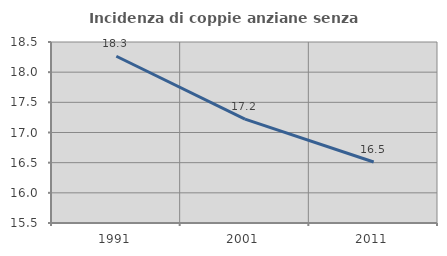
| Category | Incidenza di coppie anziane senza figli  |
|---|---|
| 1991.0 | 18.263 |
| 2001.0 | 17.221 |
| 2011.0 | 16.511 |